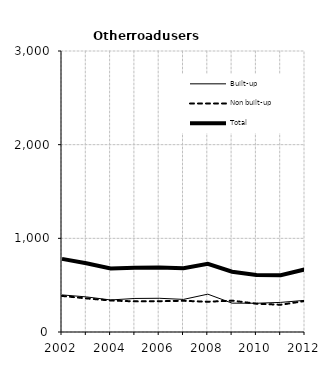
| Category | Built-up | Non built-up | Total |
|---|---|---|---|
| 2002.0 | 396 | 385 | 781 |
| 2003.0 | 375 | 359 | 734 |
| 2004.0 | 342 | 336 | 678 |
| 2005.0 | 358 | 327 | 685 |
| 2006.0 | 360 | 329 | 689 |
| 2007.0 | 348 | 333 | 681 |
| 2008.0 | 404 | 323 | 727 |
| 2009.0 | 308 | 335 | 643 |
| 2010.0 | 307 | 302 | 609 |
| 2011.0 | 316 | 291 | 607 |
| 2012.0 | 338 | 331 | 669 |